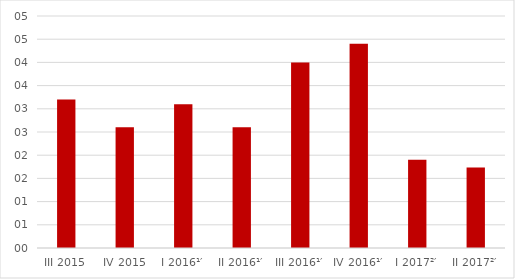
| Category | Series 0 |
|---|---|
| III 2015 | 3.2 |
| IV 2015 | 2.6 |
| I 2016¹′ | 3.1 |
| II 2016¹′ | 2.6 |
| III 2016¹′ | 4 |
| IV 2016¹′ | 4.4 |
| I 2017²′ | 1.903 |
| II 2017²′ | 1.733 |